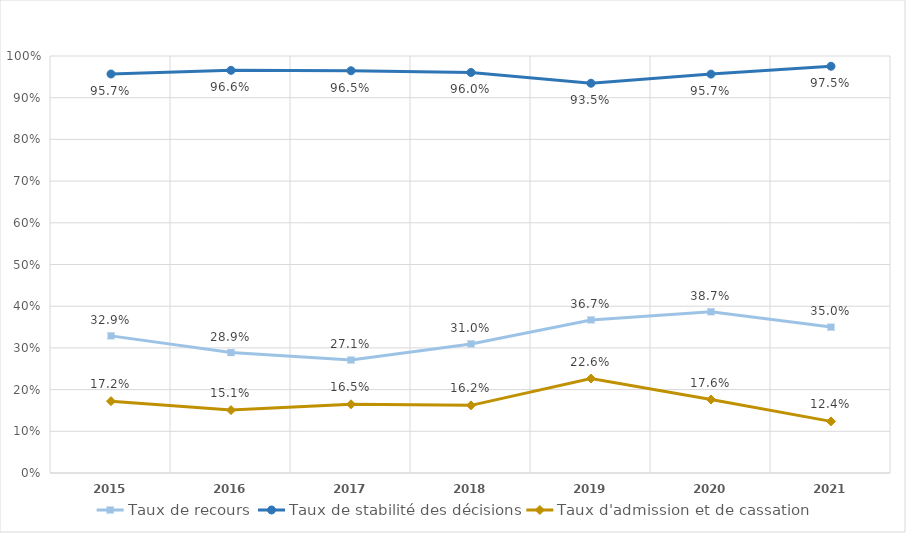
| Category | Taux de recours | Taux de stabilité des décisions | Taux d'admission et de cassation |
|---|---|---|---|
| 2015.0 | 0.329 | 0.957 | 0.172 |
| 2016.0 | 0.289 | 0.966 | 0.151 |
| 2017.0 | 0.271 | 0.965 | 0.165 |
| 2018.0 | 0.31 | 0.96 | 0.162 |
| 2019.0 | 0.367 | 0.935 | 0.226 |
| 2020.0 | 0.387 | 0.957 | 0.176 |
| 2021.0 | 0.35 | 0.975 | 0.124 |